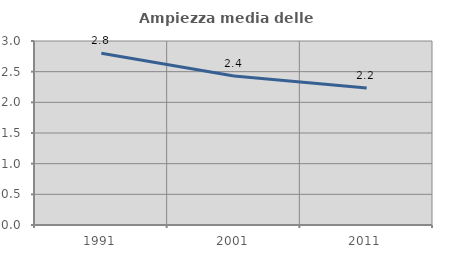
| Category | Ampiezza media delle famiglie |
|---|---|
| 1991.0 | 2.801 |
| 2001.0 | 2.429 |
| 2011.0 | 2.232 |